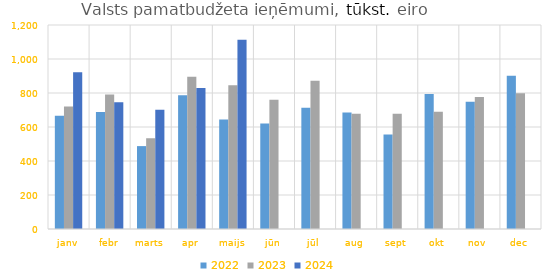
| Category | 2022 | 2023 | 2024 |
|---|---|---|---|
| janv | 666661.352 | 719939.35 | 921874.013 |
| febr | 687779.931 | 791517.955 | 745501.692 |
| marts | 487592.334 | 533224.214 | 701863.549 |
| apr | 787062.79 | 895993.736 | 828734.151 |
| maijs | 644004.073 | 845157.912 | 1112888.002 |
| jūn | 620273.485 | 760374.013 | 0 |
| jūl | 713962.301 | 871539.884 | 0 |
| aug | 685067.765 | 678022.747 | 0 |
| sept | 556332.319 | 678643.792 | 0 |
| okt | 794230.202 | 689799.53 | 0 |
| nov | 747989.336 | 777169.422 | 0 |
| dec | 900960.999 | 799044.443 | 0 |